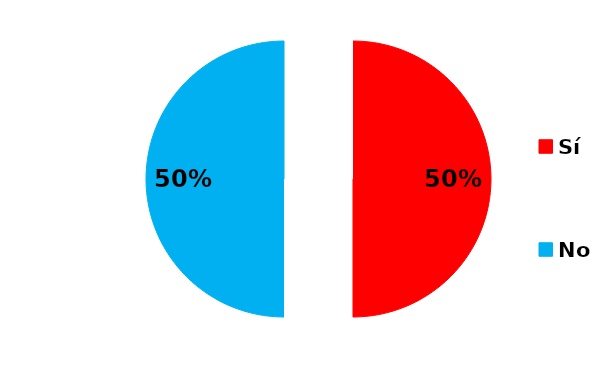
| Category | Series 0 |
|---|---|
| Sí | 6 |
| No | 6 |